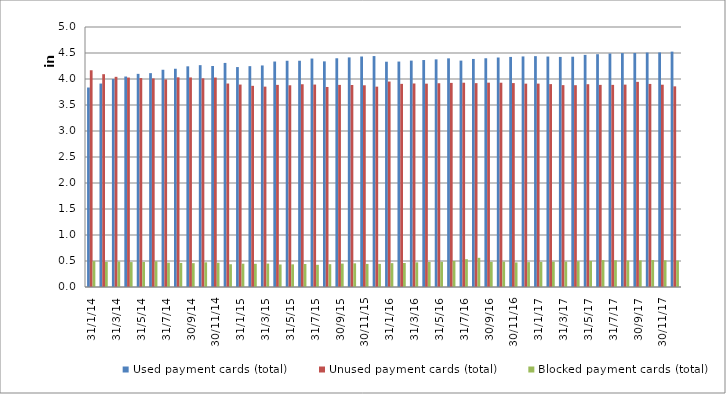
| Category | Used payment cards (total) | Unused payment cards (total) | Blocked payment cards (total) |
|---|---|---|---|
| 2014-01-31 | 3836223 | 4168119 | 496879 |
| 2014-02-28 | 3912476 | 4092450 | 483584 |
| 2014-03-31 | 3998938 | 4041785 | 489650 |
| 2014-04-30 | 4047703 | 4027792 | 479192 |
| 2014-05-31 | 4099052 | 4017826 | 481021 |
| 2014-06-30 | 4112641 | 4010796 | 493863 |
| 2014-07-31 | 4177537 | 3991566 | 467955 |
| 2014-08-31 | 4197152 | 4032029 | 462518 |
| 2014-09-30 | 4243834 | 4029659 | 458643 |
| 2014-10-31 | 4266326 | 4012706 | 474470 |
| 2014-11-30 | 4250217 | 4027993 | 467318 |
| 2014-12-31 | 4309282 | 3913019 | 437729 |
| 2015-01-31 | 4229408 | 3892960 | 448216 |
| 2015-02-28 | 4247165 | 3868610 | 446016 |
| 2015-03-31 | 4260522 | 3853338 | 450612 |
| 2015-04-30 | 4335963 | 3886894 | 433337 |
| 2015-05-31 | 4350712 | 3879402 | 436006 |
| 2015-06-30 | 4351179 | 3899077 | 442764 |
| 2015-07-31 | 4393558 | 3892978 | 427199 |
| 2015-08-31 | 4338952 | 3846770 | 439013 |
| 2015-09-30 | 4398831 | 3886560 | 450384 |
| 2015-10-31 | 4415377 | 3884162 | 455159 |
| 2015-11-30 | 4432710 | 3878924 | 444458 |
| 2015-12-31 | 4441122 | 3852949 | 444922 |
| 2016-01-31 | 4332390 | 3951033 | 458740 |
| 2016-02-29 | 4335492 | 3906412 | 461489 |
| 2016-03-31 | 4353588 | 3913926 | 473928 |
| 2016-04-30 | 4364667 | 3910281 | 481502 |
| 2016-05-31 | 4377599 | 3918512 | 484770 |
| 2016-06-30 | 4397146 | 3925078 | 499871 |
| 2016-07-31 | 4353754 | 3928567 | 534914 |
| 2016-08-31 | 4385699 | 3920372 | 561363 |
| 2016-09-30 | 4398873 | 3929420 | 482990 |
| 2016-10-31 | 4413327 | 3928433 | 487271 |
| 2016-11-30 | 4424704 | 3921612 | 472655 |
| 2016-12-31 | 4433927 | 3910471 | 478422 |
| 2017-01-31 | 4439440 | 3911465 | 482368 |
| 2017-02-28 | 4431781 | 3901773 | 486947 |
| 2017-03-31 | 4424764 | 3882003 | 488411 |
| 2017-04-30 | 4428633 | 3880936 | 495125 |
| 2017-05-31 | 4463865 | 3899703 | 500119 |
| 2017-06-30 | 4476802 | 3886985 | 516888 |
| 2017-07-31 | 4490420 | 3887104 | 513284 |
| 2017-08-31 | 4498388 | 3891883 | 508628 |
| 2017-09-30 | 4500635 | 3945062 | 510835 |
| 2017-10-31 | 4508944 | 3905406 | 517837 |
| 2017-11-30 | 4510523 | 3890324 | 513196 |
| 2017-12-31 | 4526497 | 3858583 | 509092 |